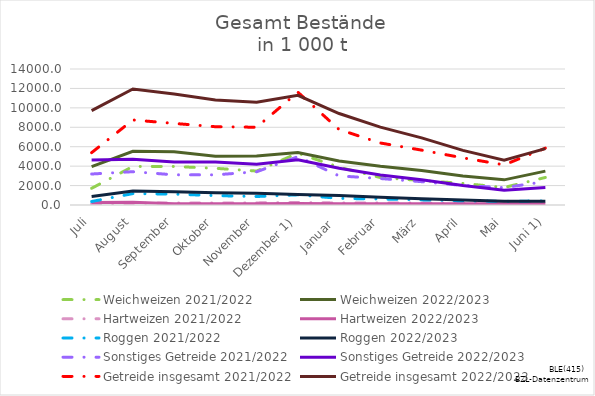
| Category | Weichweizen | Hartweizen | Roggen | Sonstiges Getreide | Getreide insgesamt |
|---|---|---|---|---|---|
| Juli | 3946.604 | 267.252 | 866.46 | 4630.846 | 9711.162 |
| August | 5520.476 | 274.119 | 1443.263 | 4707.668 | 11945.525 |
| September | 5488.945 | 130.324 | 1363.501 | 4436.069 | 11418.839 |
| Oktober | 5012.895 | 131.502 | 1252.901 | 4418.63 | 10815.928 |
| November | 5043.961 | 131.979 | 1203.22 | 4187.562 | 10566.722 |
| Dezember 1) | 5402.136 | 144.532 | 1085.023 | 4658.316 | 11290.007 |
| Januar  | 4533.647 | 126.935 | 974.862 | 3780.505 | 9415.948 |
| Februar | 3985.086 | 128.833 | 808.14 | 3092.272 | 8014.331 |
| März | 3550.208 | 126.442 | 631.822 | 2605.86 | 6914.332 |
| April | 2983.151 | 120.013 | 510.438 | 2005.841 | 5619.443 |
| Mai | 2588.362 | 116.798 | 389.467 | 1509.739 | 4604.366 |
| Juni 1) | 3484.118 | 138.614 | 379.077 | 1798.796 | 5800.604 |